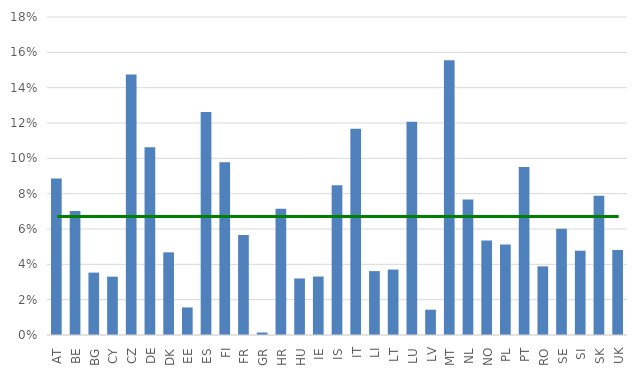
| Category | Series 0 |
|---|---|
| AT | 0.089 |
| BE | 0.07 |
| BG | 0.035 |
| CY | 0.033 |
| CZ | 0.147 |
| DE | 0.106 |
| DK | 0.047 |
| EE | 0.016 |
| ES | 0.126 |
| FI | 0.098 |
| FR | 0.057 |
| GR | 0.001 |
| HR | 0.071 |
| HU | 0.032 |
| IE | 0.033 |
| IS | 0.085 |
| IT | 0.117 |
| LI | 0.036 |
| LT | 0.037 |
| LU | 0.121 |
| LV | 0.014 |
| MT | 0.155 |
| NL | 0.077 |
| NO | 0.053 |
| PL | 0.051 |
| PT | 0.095 |
| RO | 0.039 |
| SE | 0.06 |
| SI | 0.048 |
| SK | 0.079 |
| UK | 0.048 |